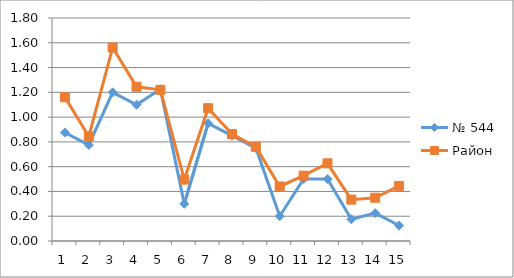
| Category | № 544 | Район |
|---|---|---|
| 0 | 0.875 | 1.16 |
| 1 | 0.775 | 0.844 |
| 2 | 1.2 | 1.562 |
| 3 | 1.1 | 1.245 |
| 4 | 1.225 | 1.22 |
| 5 | 0.3 | 0.496 |
| 6 | 0.95 | 1.072 |
| 7 | 0.85 | 0.863 |
| 8 | 0.75 | 0.76 |
| 9 | 0.2 | 0.44 |
| 10 | 0.5 | 0.527 |
| 11 | 0.5 | 0.627 |
| 12 | 0.175 | 0.334 |
| 13 | 0.225 | 0.349 |
| 14 | 0.125 | 0.445 |